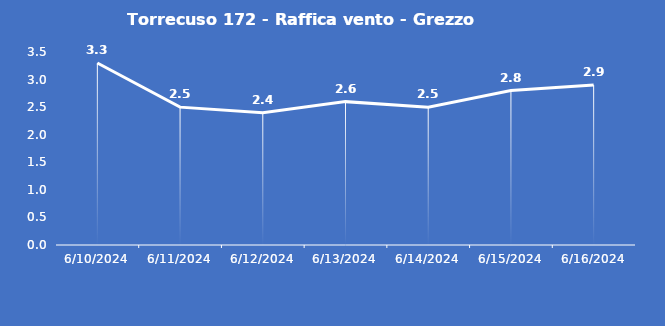
| Category | Torrecuso 172 - Raffica vento - Grezzo (m/s) |
|---|---|
| 6/10/24 | 3.3 |
| 6/11/24 | 2.5 |
| 6/12/24 | 2.4 |
| 6/13/24 | 2.6 |
| 6/14/24 | 2.5 |
| 6/15/24 | 2.8 |
| 6/16/24 | 2.9 |